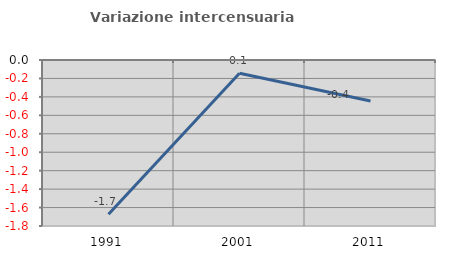
| Category | Variazione intercensuaria annua |
|---|---|
| 1991.0 | -1.672 |
| 2001.0 | -0.144 |
| 2011.0 | -0.446 |